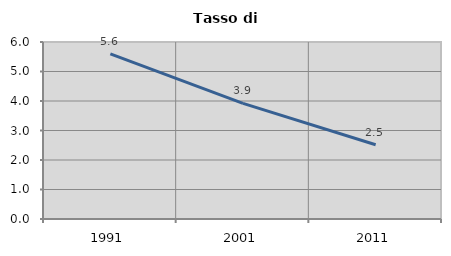
| Category | Tasso di disoccupazione   |
|---|---|
| 1991.0 | 5.594 |
| 2001.0 | 3.922 |
| 2011.0 | 2.516 |